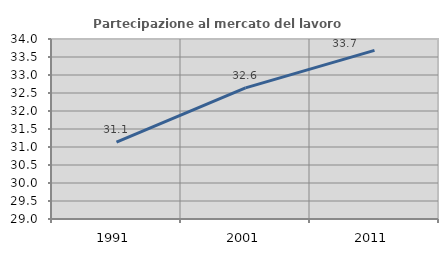
| Category | Partecipazione al mercato del lavoro  femminile |
|---|---|
| 1991.0 | 31.134 |
| 2001.0 | 32.643 |
| 2011.0 | 33.684 |